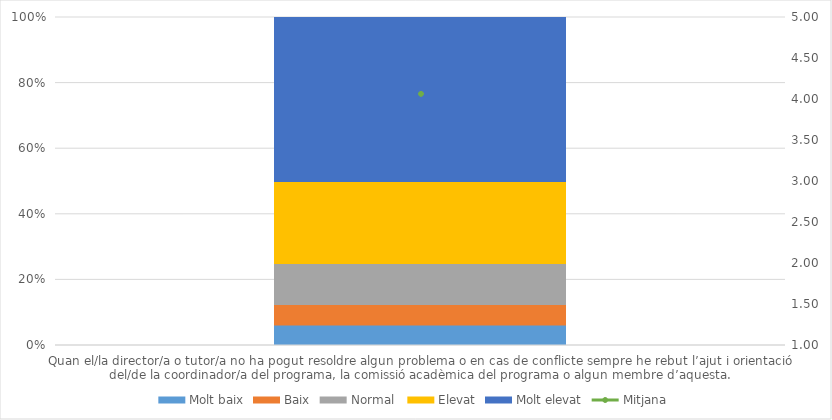
| Category | Molt baix | Baix | Normal  | Elevat | Molt elevat |
|---|---|---|---|---|---|
| Quan el/la director/a o tutor/a no ha pogut resoldre algun problema o en cas de conflicte sempre he rebut l’ajut i orientació del/de la coordinador/a del programa, la comissió acadèmica del programa o algun membre d’aquesta. | 1 | 1 | 2 | 4 | 8 |